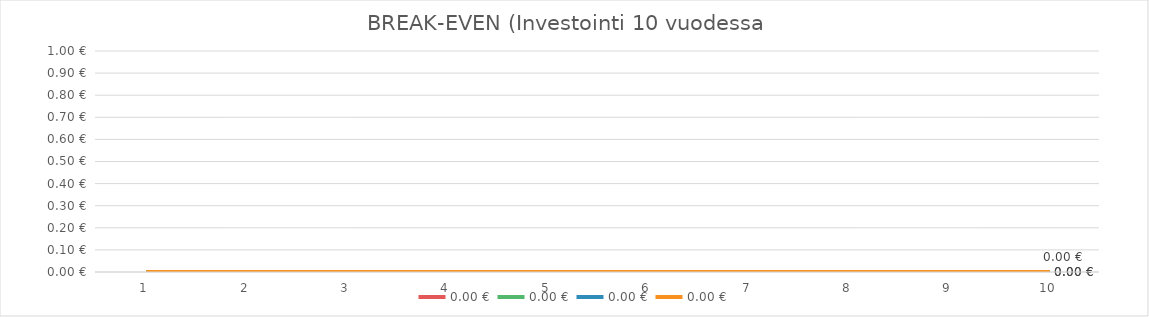
| Category | 0,00 € |
|---|---|
| 1.0 | 0 |
| 2.0 | 0 |
| 3.0 | 0 |
| 4.0 | 0 |
| 5.0 | 0 |
| 6.0 | 0 |
| 7.0 | 0 |
| 8.0 | 0 |
| 9.0 | 0 |
| 10.0 | 0 |